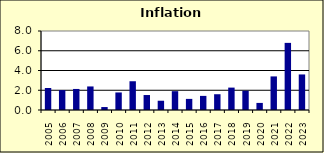
| Category | 2.7 |
|---|---|
| 2005.0 | 2.23 |
| 2006.0 | 2.018 |
| 2007.0 | 2.131 |
| 2008.0 | 2.385 |
| 2009.0 | 0.299 |
| 2010.0 | 1.777 |
| 2011.0 | 2.912 |
| 2012.0 | 1.516 |
| 2013.0 | 0.938 |
| 2014.0 | 1.907 |
| 2015.0 | 1.125 |
| 2016.0 | 1.429 |
| 2017.0 | 1.597 |
| 2018.0 | 2.268 |
| 2019.0 | 1.949 |
| 2020.0 | 0.717 |
| 2021.0 | 3.401 |
| 2022.0 | 6.797 |
| 2023.0 | 3.6 |